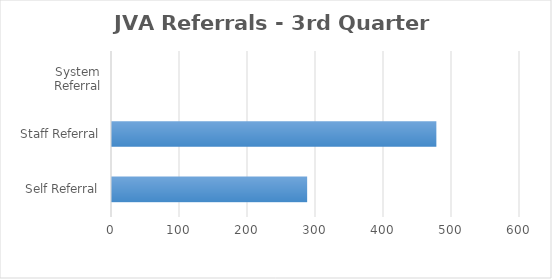
| Category | Series 0 |
|---|---|
| Self Referral | 287 |
| Staff Referral | 477 |
| System Referral | 0 |